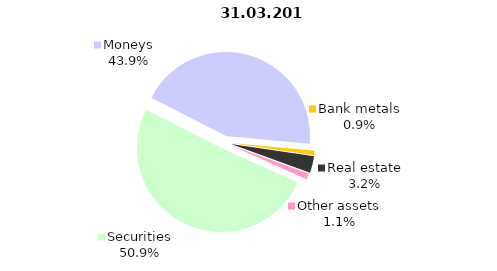
| Category | Total |
|---|---|
| Securities | 557.883 |
| Moneys | 481.902 |
| Bank metals | 9.455 |
| Real estate | 35.103 |
| Other assets | 12.238 |